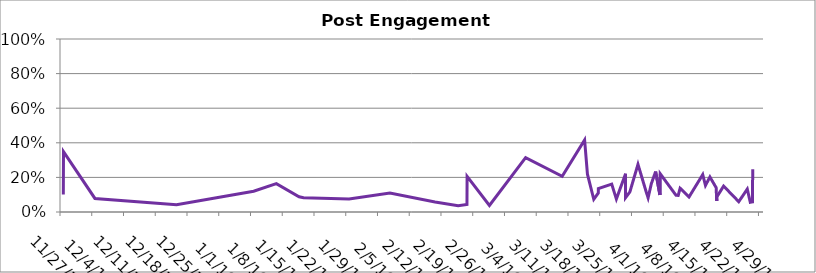
| Category | Post Engagement Rate |
|---|---|
| 42335.7325462963 | 0.101 |
| 42335.77127314815 | 0.349 |
| 42342.69805555556 | 0.078 |
| 42360.68871527778 | 0.042 |
| 42377.69762731482 | 0.12 |
| 42382.7049537037 | 0.164 |
| 42387.70706018519 | 0.088 |
| 42388.708333333336 | 0.082 |
| 42398.73564814815 | 0.075 |
| 42407.74508101852 | 0.11 |
| 42417.690254629626 | 0.057 |
| 42422.785416666666 | 0.037 |
| 42424.728321759256 | 0.043 |
| 42424.75877314815 | 0.206 |
| 42429.68247685185 | 0.038 |
| 42437.65972222222 | 0.315 |
| 42445.728634259256 | 0.207 |
| 42450.666666666664 | 0.416 |
| 42451.29167824074 | 0.218 |
| 42452.68917824074 | 0.073 |
| 42453.69112268519 | 0.11 |
| 42453.69788194444 | 0.135 |
| 42456.64465277778 | 0.162 |
| 42457.67302083333 | 0.074 |
| 42459.69939814815 | 0.222 |
| 42459.70501157407 | 0.083 |
| 42460.645833333336 | 0.116 |
| 42462.43377314815 | 0.276 |
| 42464.291666666664 | 0.112 |
| 42464.666666666664 | 0.082 |
| 42465.381898148145 | 0.164 |
| 42466.32618055555 | 0.234 |
| 42467.26729166666 | 0.099 |
| 42467.33252314815 | 0.221 |
| 42470.820763888885 | 0.097 |
| 42471.304606481484 | 0.096 |
| 42471.72292824074 | 0.137 |
| 42473.69283564815 | 0.087 |
| 42476.7109837963 | 0.216 |
| 42476.72887731482 | 0.213 |
| 42477.315729166665 | 0.154 |
| 42478.295486111114 | 0.203 |
| 42479.666666666664 | 0.141 |
| 42479.79837962963 | 0.064 |
| 42479.81917824074 | 0.087 |
| 42481.316157407404 | 0.15 |
| 42484.65262731481 | 0.06 |
| 42486.53104166667 | 0.132 |
| 42487.197604166664 | 0.056 |
| 42487.66611111111 | 0.058 |
| 42487.735810185186 | 0.248 |